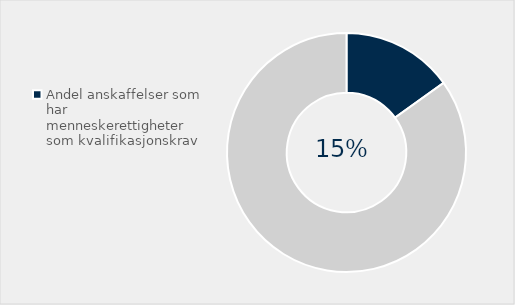
| Category | Series 0 |
|---|---|
| Andel anskaffelser som har menneskerettigheter som kvalifikasjonskrav | 0.151 |
| Ikke stilt krav | 0.849 |